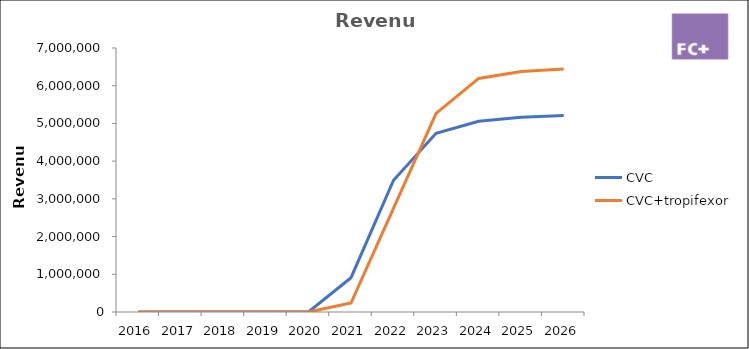
| Category | CVC | CVC+tropifexor |
|---|---|---|
| 2016.0 | 0 | 0 |
| 2017.0 | 0 | 0 |
| 2018.0 | 0 | 0 |
| 2019.0 | 0 | 0 |
| 2020.0 | 0 | 0 |
| 2021.0 | 909576.422 | 238860.451 |
| 2022.0 | 3492811.355 | 2753041.843 |
| 2023.0 | 4737709.418 | 5267270.621 |
| 2024.0 | 5059265.874 | 6192992.996 |
| 2025.0 | 5161479.908 | 6377376.519 |
| 2026.0 | 5213094.707 | 6441150.284 |